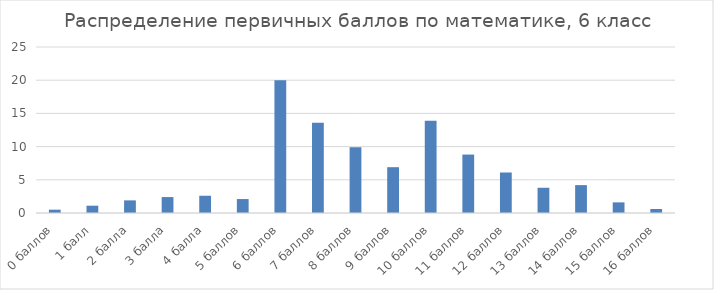
| Category | Series 0 |
|---|---|
| 0 баллов | 0.5 |
| 1 балл | 1.1 |
| 2 балла | 1.9 |
| 3 балла | 2.4 |
| 4 балла | 2.6 |
| 5 баллов | 2.1 |
| 6 баллов | 20 |
| 7 баллов | 13.6 |
| 8 баллов | 9.9 |
| 9 баллов | 6.9 |
| 10 баллов | 13.9 |
| 11 баллов | 8.8 |
| 12 баллов | 6.1 |
| 13 баллов | 3.8 |
| 14 баллов | 4.2 |
| 15 баллов | 1.6 |
| 16 баллов | 0.6 |